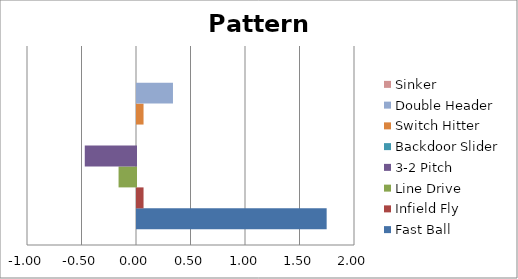
| Category | Fast Ball | Infield Fly | Line Drive | 3-2 Pitch | Backdoor Slider | Switch Hitter | Double Header | Sinker |
|---|---|---|---|---|---|---|---|---|
| 0 | 1.74 | 0.06 | -0.16 | -0.47 | 0 | 0.06 | 0.33 | 0 |